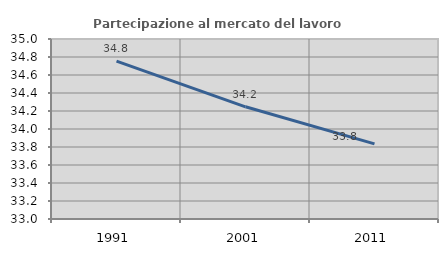
| Category | Partecipazione al mercato del lavoro  femminile |
|---|---|
| 1991.0 | 34.753 |
| 2001.0 | 34.247 |
| 2011.0 | 33.835 |